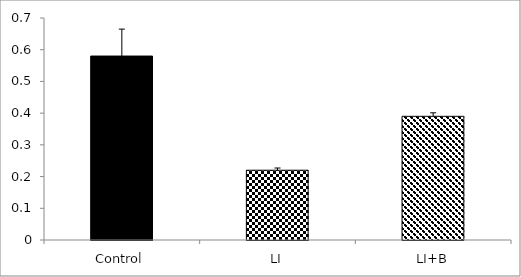
| Category | Series 0 |
|---|---|
| Control | 0.58 |
| LI | 0.22 |
| LI+B | 0.39 |